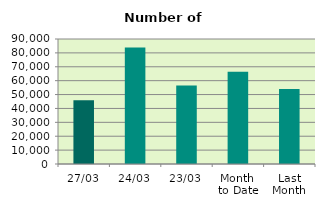
| Category | Series 0 |
|---|---|
| 27/03 | 45822 |
| 24/03 | 83850 |
| 23/03 | 56546 |
| Month 
to Date | 66441.368 |
| Last
Month | 54034.8 |